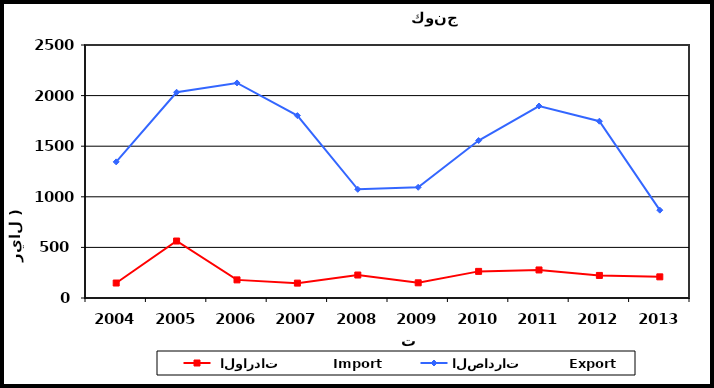
| Category |  الواردات           Import | الصادرات          Export |
|---|---|---|
| 2004.0 | 148 | 1345 |
| 2005.0 | 563 | 2033 |
| 2006.0 | 179 | 2125 |
| 2007.0 | 147 | 1802 |
| 2008.0 | 227 | 1074 |
| 2009.0 | 150 | 1094 |
| 2010.0 | 263 | 1556 |
| 2011.0 | 277 | 1897 |
| 2012.0 | 223 | 1747 |
| 2013.0 | 209 | 868 |